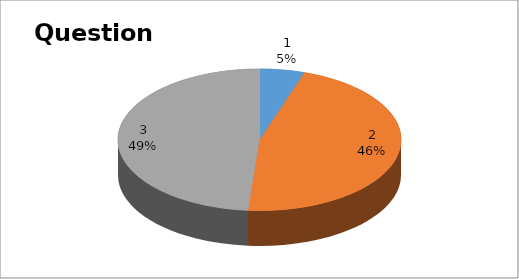
| Category | Series 0 |
|---|---|
| 0 | 2 |
| 1 | 18 |
| 2 | 19 |